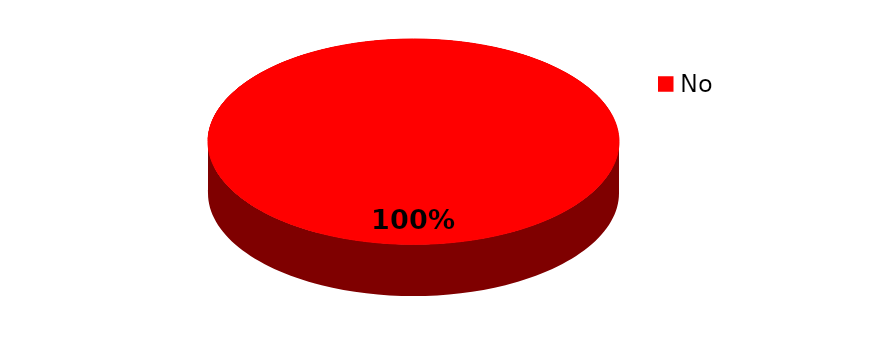
| Category | Series 0 |
|---|---|
| No | 11 |